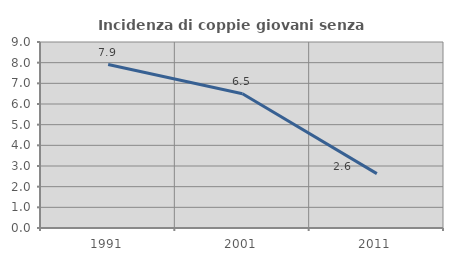
| Category | Incidenza di coppie giovani senza figli |
|---|---|
| 1991.0 | 7.907 |
| 2001.0 | 6.5 |
| 2011.0 | 2.632 |